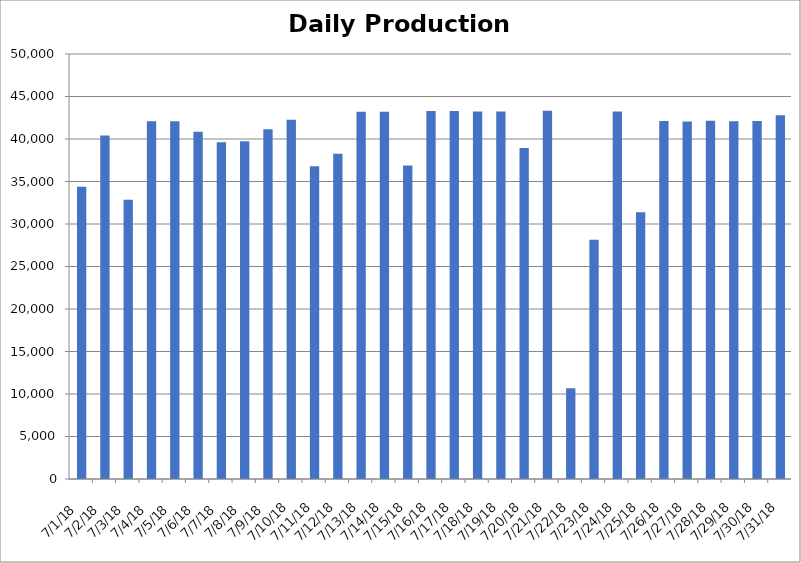
| Category | Series 0 |
|---|---|
| 7/1/18 | 34381 |
| 7/2/18 | 40409 |
| 7/3/18 | 32856 |
| 7/4/18 | 42083 |
| 7/5/18 | 42080 |
| 7/6/18 | 40846 |
| 7/7/18 | 39605 |
| 7/8/18 | 39736 |
| 7/9/18 | 41148 |
| 7/10/18 | 42254 |
| 7/11/18 | 36793 |
| 7/12/18 | 38256 |
| 7/13/18 | 43211 |
| 7/14/18 | 43220 |
| 7/15/18 | 36872 |
| 7/16/18 | 43293 |
| 7/17/18 | 43283 |
| 7/18/18 | 43241 |
| 7/19/18 | 43245 |
| 7/20/18 | 38932 |
| 7/21/18 | 43309 |
| 7/22/18 | 10662 |
| 7/23/18 | 28150 |
| 7/24/18 | 43237 |
| 7/25/18 | 31389 |
| 7/26/18 | 42131 |
| 7/27/18 | 42065 |
| 7/28/18 | 42148 |
| 7/29/18 | 42090 |
| 7/30/18 | 42122 |
| 7/31/18 | 42781 |